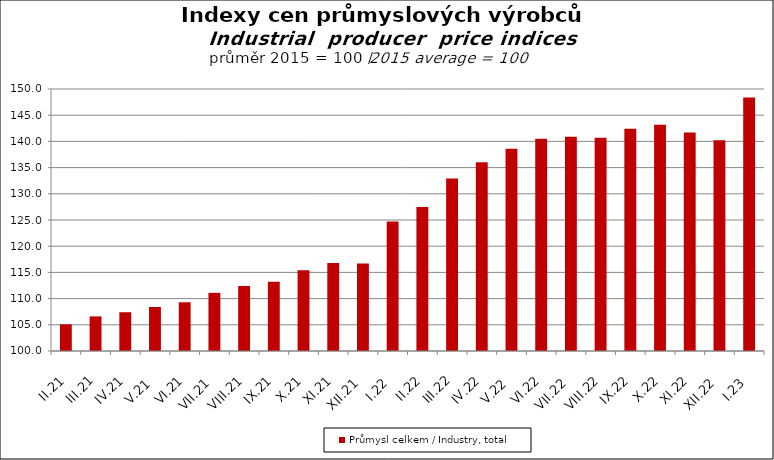
| Category | Průmysl celkem / Industry, total |
|---|---|
| II.21 | 105.1 |
| III.21 | 106.6 |
| IV.21 | 107.4 |
| V.21 | 108.4 |
| VI.21 | 109.3 |
| VII.21 | 111.1 |
| VIII.21 | 112.4 |
| IX.21 | 113.2 |
| X.21 | 115.4 |
| XI.21 | 116.8 |
| XII.21 | 116.7 |
| I.22 | 124.7 |
| II.22 | 127.5 |
| III.22 | 132.9 |
| IV.22 | 136 |
| V.22 | 138.6 |
| VI.22 | 140.5 |
| VII.22 | 140.9 |
| VIII.22 | 140.7 |
| IX.22 | 142.4 |
| X.22 | 143.2 |
| XI.22 | 141.7 |
| XII.22 | 140.2 |
| I.23 | 148.4 |